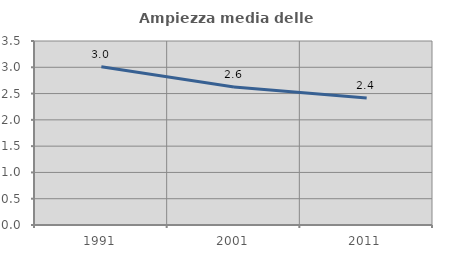
| Category | Ampiezza media delle famiglie |
|---|---|
| 1991.0 | 3.012 |
| 2001.0 | 2.626 |
| 2011.0 | 2.414 |